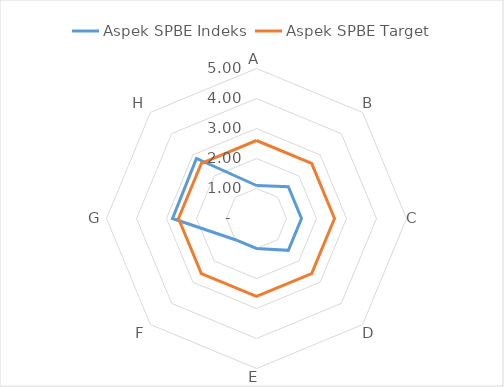
| Category | Aspek SPBE Indeks | Aspek SPBE Target |
|---|---|---|
| A | 1.1 | 2.6 |
| B | 1.5 | 2.6 |
| C | 1.5 | 2.6 |
| D | 1.5 | 2.6 |
| E | 1 | 2.6 |
| F | 1 | 2.6 |
| G | 2.8 | 2.6 |
| H | 2.83 | 2.6 |